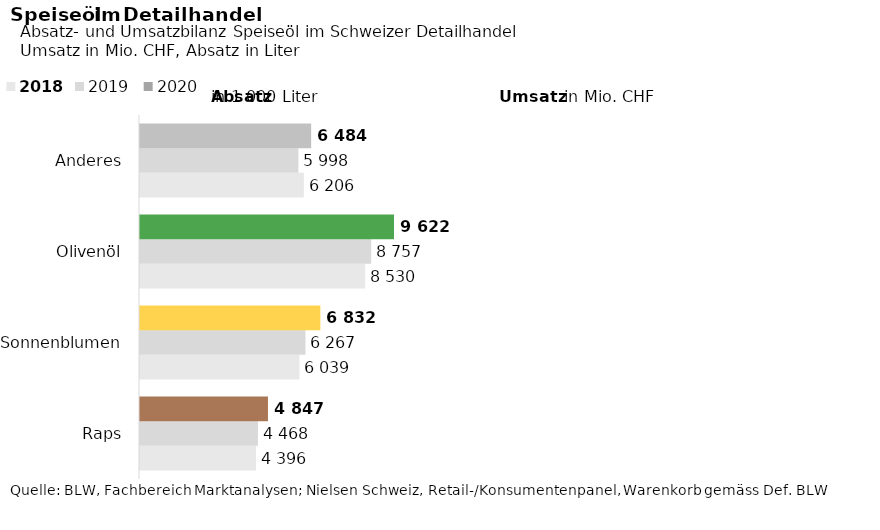
| Category | 2018 | 2019 | 2020 |
|---|---|---|---|
| Raps | 4395.699 | 4468.408 | 4847.152 |
| Sonnenblumen | 6038.943 | 6267.299 | 6831.901 |
| Olivenöl | 8530.138 | 8756.635 | 9621.549 |
| Anderes | 6206.09 | 5998.258 | 6483.97 |